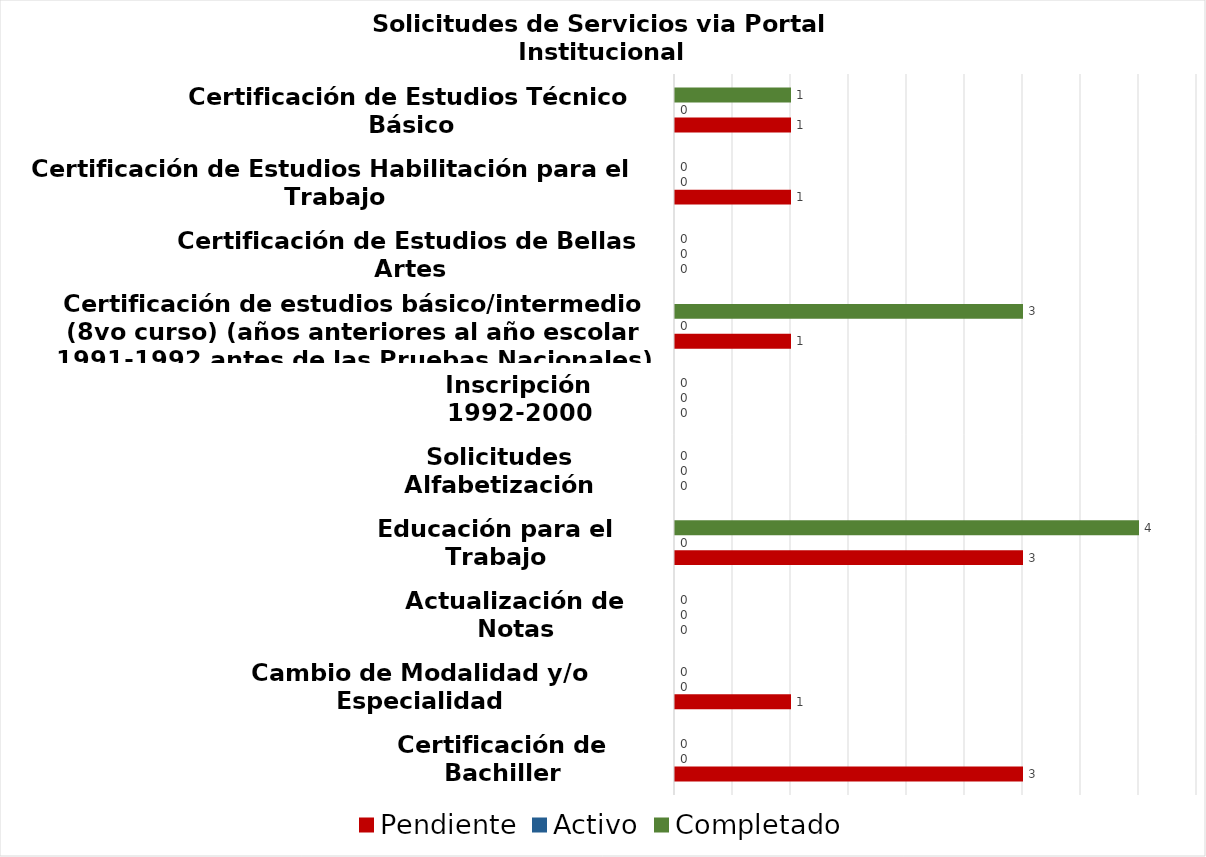
| Category | Pendiente | Activo | Completado |
|---|---|---|---|
| Certificación de Bachiller | 3 | 0 | 0 |
| Cambio de Modalidad y/o Especialidad | 1 | 0 | 0 |
| Actualización de Notas | 0 | 0 | 0 |
| Educación para el Trabajo | 3 | 0 | 4 |
| Solicitudes Alfabetización | 0 | 0 | 0 |
| Inscripción 1992-2000 | 0 | 0 | 0 |
| Certificación de estudios básico/intermedio (8vo curso) (años anteriores al año escolar 1991-1992 antes de las Pruebas Nacionales) | 1 | 0 | 3 |
| Certificación de Estudios de Bellas Artes | 0 | 0 | 0 |
| Certificación de Estudios Habilitación para el Trabajo | 1 | 0 | 0 |
| Certificación de Estudios Técnico Básico | 1 | 0 | 1 |